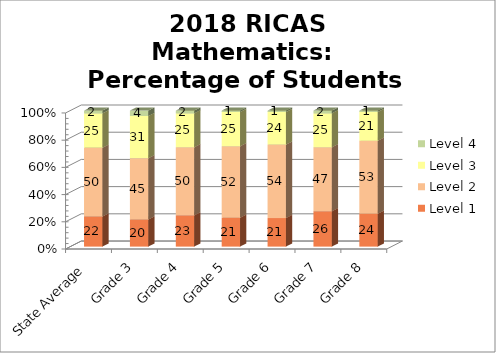
| Category | Level 1 | Level 2 | Level 3 | Level 4 |
|---|---|---|---|---|
| State Average | 22 | 50 | 25 | 2 |
| Grade 3 | 20 | 45 | 31 | 4 |
| Grade 4 | 23 | 50 | 25 | 2 |
| Grade 5 | 21 | 52 | 25 | 1 |
| Grade 6 | 21 | 54 | 24 | 1 |
| Grade 7 | 26 | 47 | 25 | 2 |
| Grade 8 | 24 | 53 | 21 | 1 |